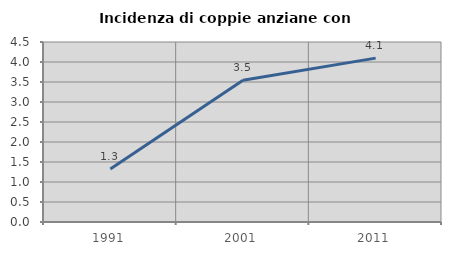
| Category | Incidenza di coppie anziane con figli |
|---|---|
| 1991.0 | 1.327 |
| 2001.0 | 3.541 |
| 2011.0 | 4.097 |